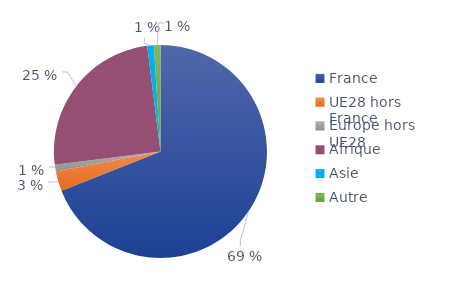
| Category | Series 0 |
|---|---|
| France | 0.69 |
| UE28 hors France | 0.03 |
| Europe hors UE28 | 0.01 |
| Afrique | 0.25 |
| Asie | 0.01 |
| Autre | 0.01 |